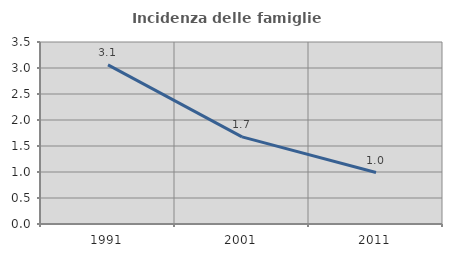
| Category | Incidenza delle famiglie numerose |
|---|---|
| 1991.0 | 3.061 |
| 2001.0 | 1.676 |
| 2011.0 | 0.99 |